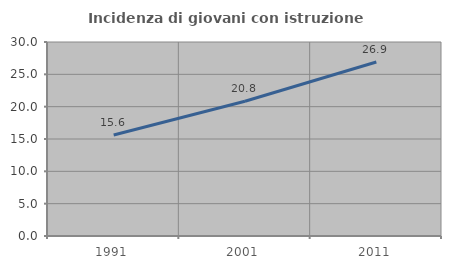
| Category | Incidenza di giovani con istruzione universitaria |
|---|---|
| 1991.0 | 15.624 |
| 2001.0 | 20.841 |
| 2011.0 | 26.906 |